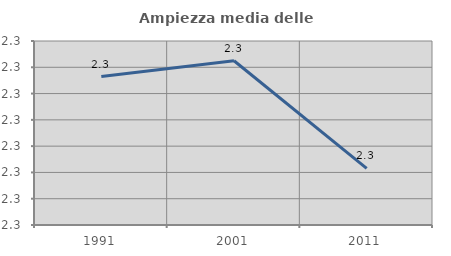
| Category | Ampiezza media delle famiglie |
|---|---|
| 1991.0 | 2.328 |
| 2001.0 | 2.331 |
| 2011.0 | 2.311 |